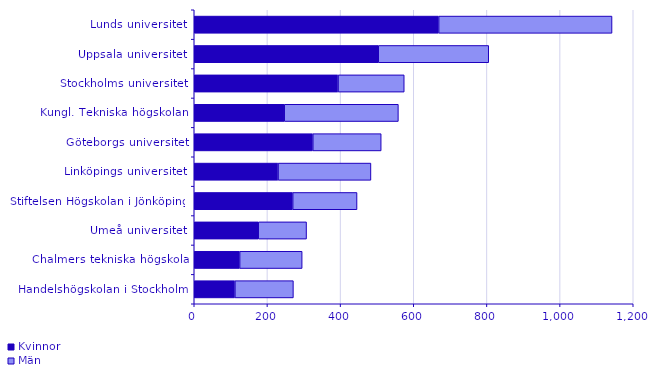
| Category | Kvinnor | Män |
|---|---|---|
| Handelshögskolan i Stockholm | 111 | 160 |
| Chalmers tekniska högskola | 124 | 171 |
| Umeå universitet | 175 | 132 |
| Stiftelsen Högskolan i Jönköping | 269 | 176 |
| Linköpings universitet | 229 | 254 |
| Göteborgs universitet | 324 | 187 |
| Kungl. Tekniska högskolan | 246 | 312 |
| Stockholms universitet | 393 | 181 |
| Uppsala universitet | 503 | 302 |
| Lunds universitet | 668 | 474 |